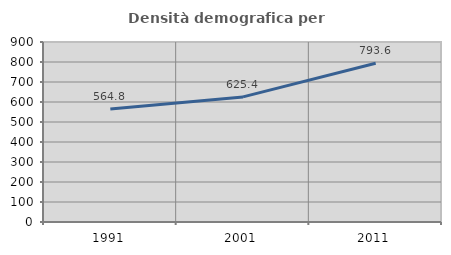
| Category | Densità demografica |
|---|---|
| 1991.0 | 564.812 |
| 2001.0 | 625.436 |
| 2011.0 | 793.571 |